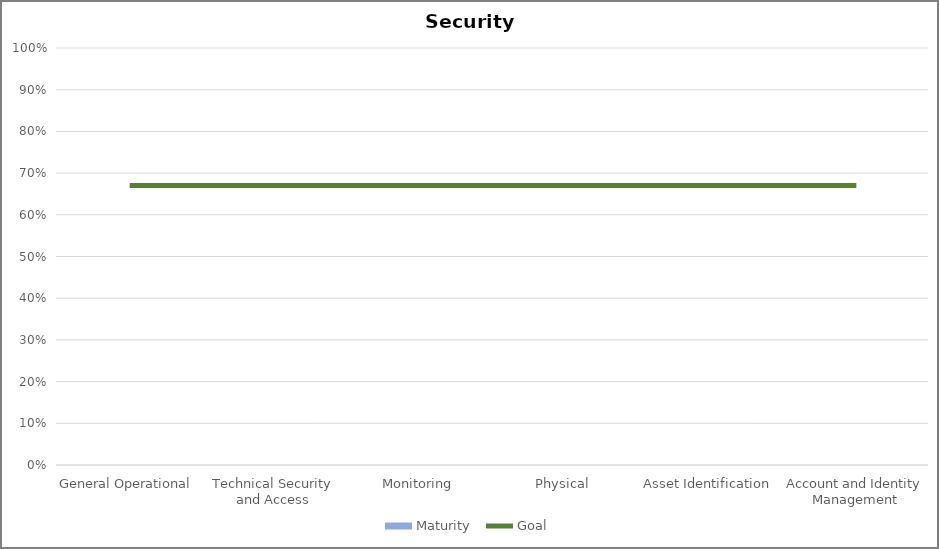
| Category | Maturity  |
|---|---|
| General Operational | 0 |
| Technical Security and Access | 0 |
| Monitoring | 0 |
| Physical | 0 |
| Asset Identification | 0 |
| Account and Identity Management | 0 |